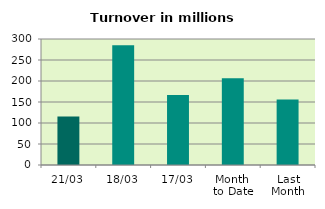
| Category | Series 0 |
|---|---|
| 21/03 | 115.21 |
| 18/03 | 285.204 |
| 17/03 | 166.746 |
| Month 
to Date | 206.749 |
| Last
Month | 156.222 |